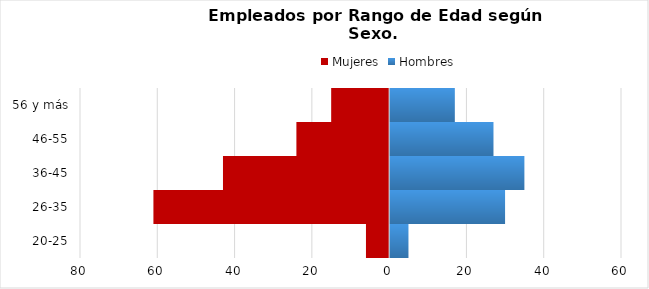
| Category | Mujeres | Hombres |
|---|---|---|
| 20-25 | -6 | 5 |
| 26-35 | -61 | 30 |
| 36-45 | -43 | 35 |
| 46-55 | -24 | 27 |
| 56 y más | -15 | 17 |